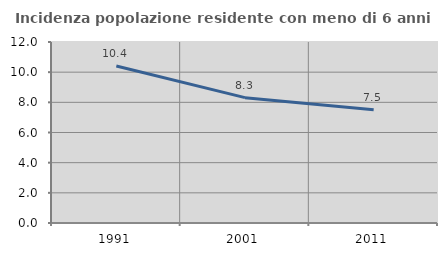
| Category | Incidenza popolazione residente con meno di 6 anni |
|---|---|
| 1991.0 | 10.406 |
| 2001.0 | 8.311 |
| 2011.0 | 7.501 |